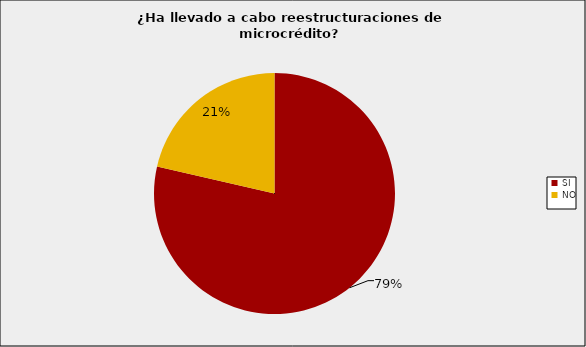
| Category | Entidades Supervisadas SFC |
|---|---|
| SI | 0.786 |
| NO | 0.214 |